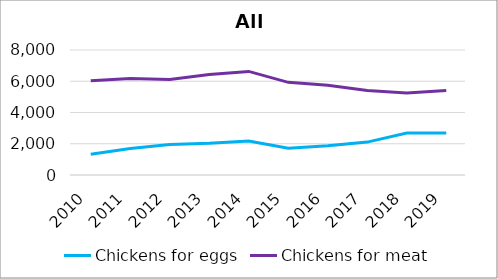
| Category | Chickens for eggs | Chickens for meat |
|---|---|---|
| 2010 | 1327.307 | 6036.444 |
| 2011 | 1696.963 | 6173.754 |
| 2012 | 1957.776 | 6115.415 |
| 2013 | 2028.922 | 6426.55 |
| 2014 | 2168.123 | 6629.782 |
| 2015 | 1711.922 | 5930.038 |
| 2016 | 1873.805 | 5748.9 |
| 2017 | 2106.337 | 5409.467 |
| 2018 | 2688.562 | 5248.53 |
| 2019 | 2691.867 | 5412.457 |